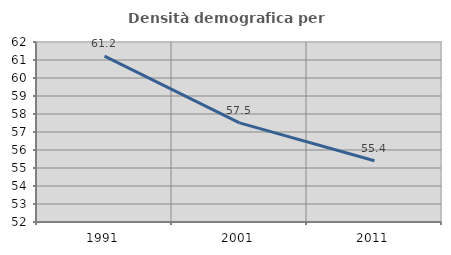
| Category | Densità demografica |
|---|---|
| 1991.0 | 61.219 |
| 2001.0 | 57.507 |
| 2011.0 | 55.402 |